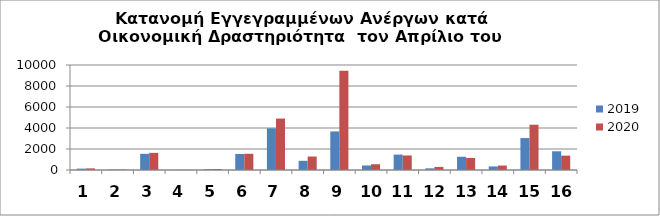
| Category | 2019 | 2020 |
|---|---|---|
| 0 | 130 | 154 |
| 1 | 36 | 38 |
| 2 | 1540 | 1630 |
| 3 | 12 | 13 |
| 4 | 74 | 93 |
| 5 | 1522 | 1545 |
| 6 | 3970 | 4898 |
| 7 | 876 | 1283 |
| 8 | 3672 | 9457 |
| 9 | 432 | 551 |
| 10 | 1467 | 1383 |
| 11 | 159 | 292 |
| 12 | 1261 | 1149 |
| 13 | 338 | 424 |
| 14 | 3043 | 4313 |
| 15 | 1783 | 1368 |